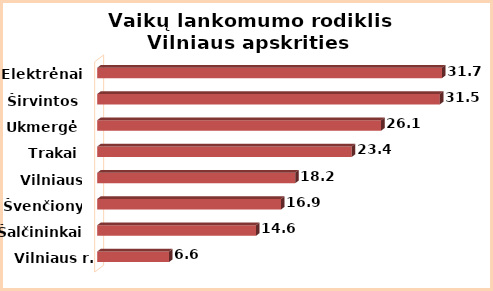
| Category | Series 0 |
|---|---|
| Vilniaus r. | 6.6 |
| Šalčininkai | 14.6 |
| Švenčionys | 16.9 |
| Vilniaus m. | 18.2 |
| Trakai | 23.4 |
| Ukmergė | 26.1 |
| Širvintos | 31.5 |
| Elektrėnai | 31.7 |